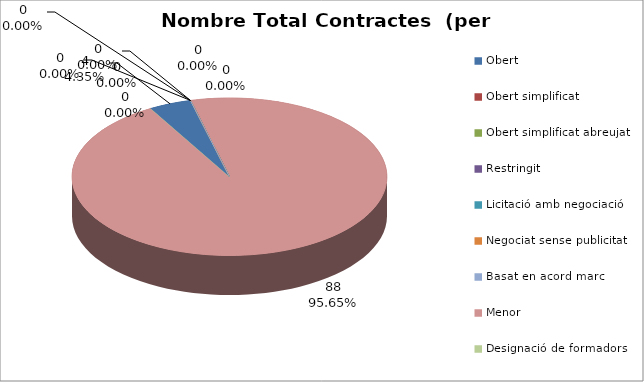
| Category | Nombre Total Contractes |
|---|---|
| Obert | 4 |
| Obert simplificat | 0 |
| Obert simplificat abreujat | 0 |
| Restringit | 0 |
| Licitació amb negociació | 0 |
| Negociat sense publicitat | 0 |
| Basat en acord marc | 0 |
| Menor | 88 |
| Designació de formadors | 0 |